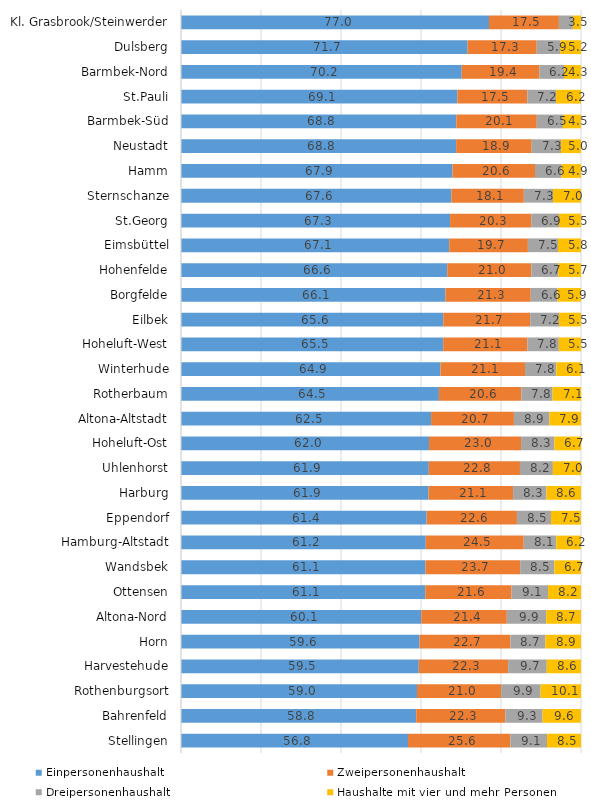
| Category | Einpersonenhaushalt | Zweipersonenhaushalt | Dreipersonenhaushalt | Haushalte mit vier und mehr Personen  |
|---|---|---|---|---|
| Kl. Grasbrook/Steinwerder | 77.001 | 17.475 | 3.495 | 2.029 |
| Dulsberg | 71.651 | 17.284 | 5.884 | 5.18 |
| Barmbek-Nord | 70.187 | 19.395 | 6.164 | 4.254 |
| St.Pauli | 69.099 | 17.49 | 7.17 | 6.241 |
| Barmbek-Süd | 68.836 | 20.116 | 6.523 | 4.525 |
| Neustadt | 68.787 | 18.891 | 7.338 | 4.984 |
| Hamm | 67.891 | 20.612 | 6.641 | 4.856 |
| Sternschanze | 67.607 | 18.102 | 7.298 | 6.993 |
| St.Georg | 67.266 | 20.292 | 6.936 | 5.506 |
| Eimsbüttel | 67.053 | 19.671 | 7.516 | 5.759 |
| Hohenfelde | 66.568 | 21.042 | 6.696 | 5.695 |
| Borgfelde | 66.112 | 21.331 | 6.635 | 5.922 |
| Eilbek | 65.567 | 21.726 | 7.208 | 5.5 |
| Hoheluft-West | 65.541 | 21.084 | 7.832 | 5.543 |
| Winterhude | 64.876 | 21.131 | 7.843 | 6.15 |
| Rotherbaum | 64.481 | 20.616 | 7.795 | 7.107 |
| Altona-Altstadt | 62.517 | 20.721 | 8.86 | 7.902 |
| Hoheluft-Ost | 62.003 | 23.01 | 8.328 | 6.659 |
| Uhlenhorst | 61.948 | 22.795 | 8.231 | 7.027 |
| Harburg | 61.892 | 21.131 | 8.336 | 8.641 |
| Eppendorf | 61.41 | 22.574 | 8.51 | 7.505 |
| Hamburg-Altstadt | 61.192 | 24.503 | 8.146 | 6.159 |
| Wandsbek | 61.114 | 23.679 | 8.55 | 6.658 |
| Ottensen | 61.074 | 21.563 | 9.117 | 8.245 |
| Altona-Nord | 60.066 | 21.391 | 9.853 | 8.69 |
| Horn | 59.625 | 22.743 | 8.735 | 8.897 |
| Harvestehude | 59.45 | 22.34 | 9.657 | 8.553 |
| Rothenburgsort | 59.002 | 21.028 | 9.879 | 10.091 |
| Bahrenfeld | 58.806 | 22.308 | 9.282 | 9.605 |
| Stellingen | 56.759 | 25.594 | 9.149 | 8.498 |